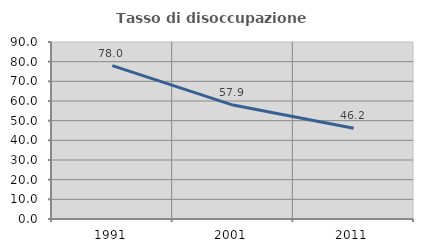
| Category | Tasso di disoccupazione giovanile  |
|---|---|
| 1991.0 | 77.966 |
| 2001.0 | 57.933 |
| 2011.0 | 46.179 |